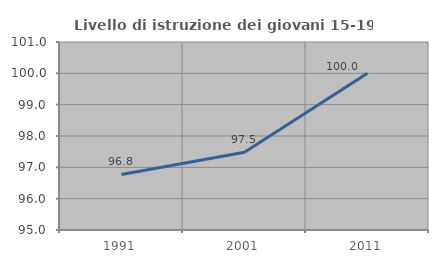
| Category | Livello di istruzione dei giovani 15-19 anni |
|---|---|
| 1991.0 | 96.774 |
| 2001.0 | 97.484 |
| 2011.0 | 100 |